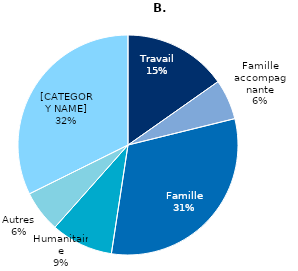
| Category | Series 0 |
|---|---|
| Travail | 499341.082 |
| Famille accompagnante | 193867.538 |
| Famille | 1024963.369 |
| Humanitaire | 299538.054 |
| Autres | 200611.081 |
| Libre circulation | 1059474.476 |